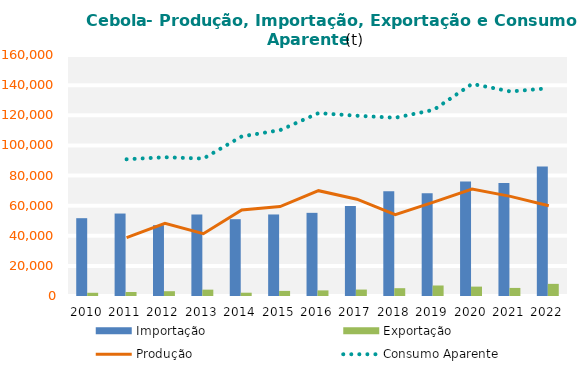
| Category | Importação | Exportação |
|---|---|---|
| 0 | 51658.769 | 2139.582 |
| 1 | 54746.836 | 2657.99 |
| 2 | 47002.454 | 3184.468 |
| 3 | 54110.571 | 4217.83 |
| 4 | 50997.864 | 2185.038 |
| 5 | 54131.63 | 3386.31 |
| 6 | 55210.466 | 3720.843 |
| 7 | 59698.449 | 4272.494 |
| 8 | 69565.692 | 5187.066 |
| 9 | 68218.071 | 6972.523 |
| 10 | 76044.932 | 6227.453 |
| 11 | 75002.936 | 5358.488 |
| 12 | 86017.915 | 8053.52 |